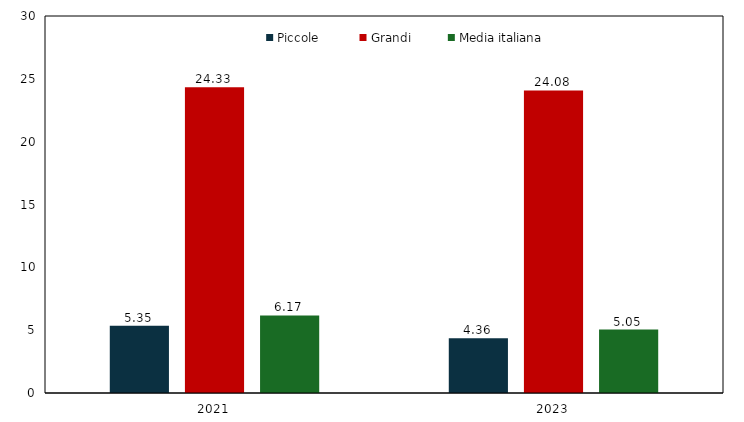
| Category | Piccole  | Grandi | Media italiana |
|---|---|---|---|
| 2021.0 | 5.35 | 24.33 | 6.17 |
| 2023.0 | 4.36 | 24.08 | 5.05 |